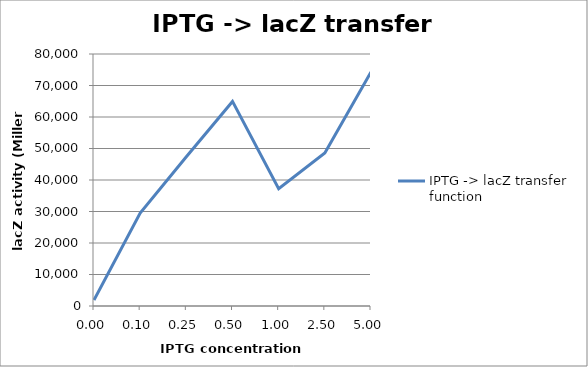
| Category | IPTG -> lacZ transfer function |
|---|---|
| 0.0 | 1892.678 |
| 0.1 | 29470.501 |
| 0.25 | 47374.932 |
| 0.5 | 64945.55 |
| 1.0 | 37258.646 |
| 2.5 | 48567.95 |
| 5.0 | 74273.028 |